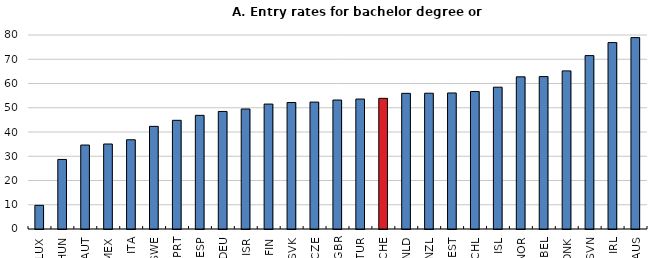
| Category | Series 0 |
|---|---|
| LUX | 9.752 |
| HUN | 28.685 |
| AUT | 34.623 |
| MEX | 35.05 |
| ITA | 36.802 |
| SWE | 42.325 |
| PRT | 44.823 |
| ESP | 46.865 |
| DEU | 48.474 |
| ISR | 49.494 |
| FIN | 51.52 |
| SVK | 52.156 |
| CZE | 52.329 |
| GBR | 53.185 |
| TUR | 53.583 |
| CHE | 53.879 |
| NLD | 55.942 |
| NZL | 55.99 |
| EST | 56.091 |
| CHL | 56.705 |
| ISL | 58.478 |
| NOR | 62.751 |
| BEL | 62.844 |
| DNK | 65.202 |
| SVN | 71.506 |
| IRL | 76.866 |
| AUS | 78.927 |